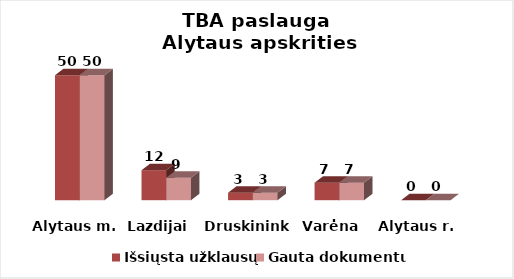
| Category | Išsiųsta užklausų | Gauta dokumentų |
|---|---|---|
| Alytaus m. | 50 | 50 |
| Lazdijai | 12 | 9 |
| Druskininkai | 3 | 3 |
| Varėna | 7 | 7 |
| Alytaus r. | 0 | 0 |